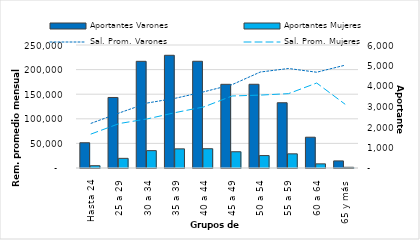
| Category | Aportantes Varones | Aportantes Mujeres |
|---|---|---|
| Hasta 24 | 1231 | 112 |
| 25 a 29 | 3440 | 471 |
| 30 a 34 | 5204 | 847 |
| 35 a 39 | 5498 | 934 |
| 40 a 44 | 5206 | 940 |
| 45 a 49 | 4082 | 793 |
| 50 a 54 | 4084 | 606 |
| 55 a 59 | 3183 | 691 |
| 60 a 64 | 1502 | 202 |
| 65 y más | 346 | 35 |